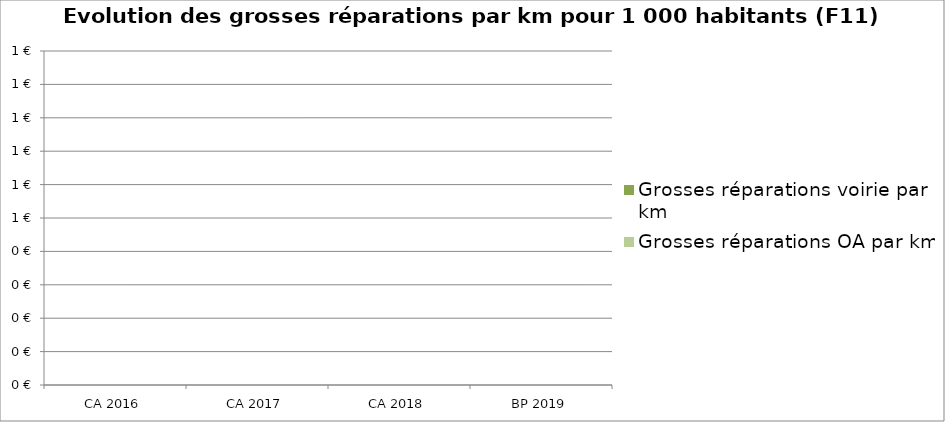
| Category | Grosses réparations voirie par km | Grosses réparations OA par km |
|---|---|---|
| CA 2016 | 0 | 0 |
| CA 2017 | 0 | 0 |
| CA 2018 | 0 | 0 |
| BP 2019 | 0 | 0 |